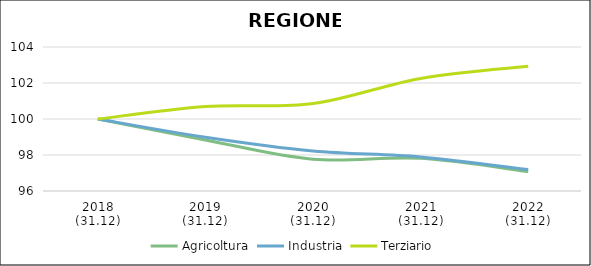
| Category | Agricoltura | Industria | Terziario |
|---|---|---|---|
| 2018
(31.12) | 100 | 100 | 100 |
| 2019
(31.12) | 98.835 | 98.988 | 100.692 |
| 2020
(31.12) | 97.767 | 98.223 | 100.859 |
| 2021
(31.12) | 97.813 | 97.892 | 102.254 |
| 2022
(31.12) | 97.079 | 97.195 | 102.925 |